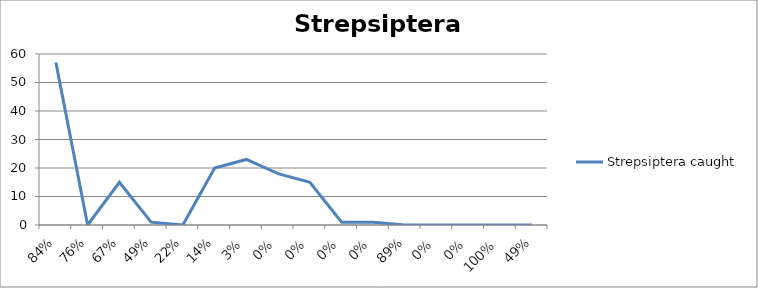
| Category | Strepsiptera caught |
|---|---|
| 0.84 | 57 |
| 0.76 | 0 |
| 0.67 | 15 |
| 0.49 | 1 |
| 0.22 | 0 |
| 0.14 | 20 |
| 0.03 | 23 |
| 0.0 | 18 |
| 0.0 | 15 |
| 0.0 | 1 |
| 0.0 | 1 |
| 0.89 | 0 |
| 0.0 | 0 |
| 0.0 | 0 |
| 1.0 | 0 |
| 0.49 | 0 |